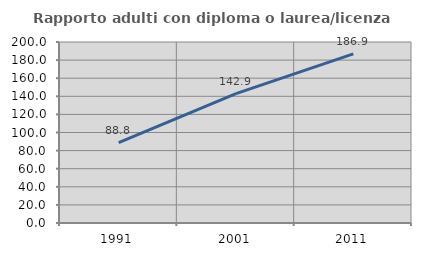
| Category | Rapporto adulti con diploma o laurea/licenza media  |
|---|---|
| 1991.0 | 88.759 |
| 2001.0 | 142.874 |
| 2011.0 | 186.9 |